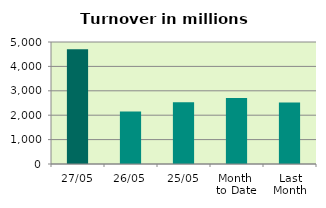
| Category | Series 0 |
|---|---|
| 27/05 | 4707.438 |
| 26/05 | 2152.843 |
| 25/05 | 2535.798 |
| Month 
to Date | 2704.946 |
| Last
Month | 2525.558 |